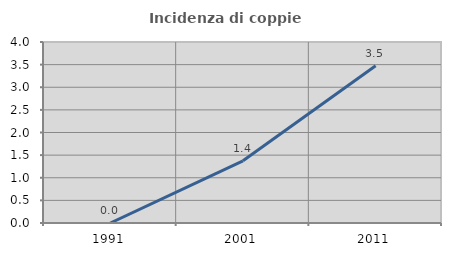
| Category | Incidenza di coppie miste |
|---|---|
| 1991.0 | 0 |
| 2001.0 | 1.375 |
| 2011.0 | 3.475 |